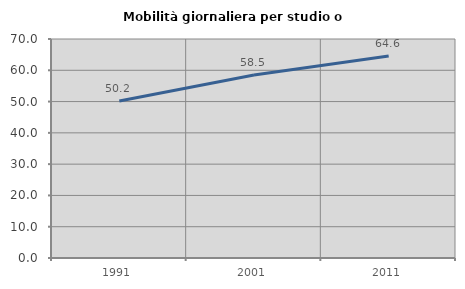
| Category | Mobilità giornaliera per studio o lavoro |
|---|---|
| 1991.0 | 50.192 |
| 2001.0 | 58.509 |
| 2011.0 | 64.571 |